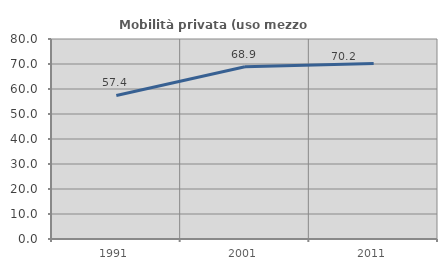
| Category | Mobilità privata (uso mezzo privato) |
|---|---|
| 1991.0 | 57.404 |
| 2001.0 | 68.872 |
| 2011.0 | 70.247 |